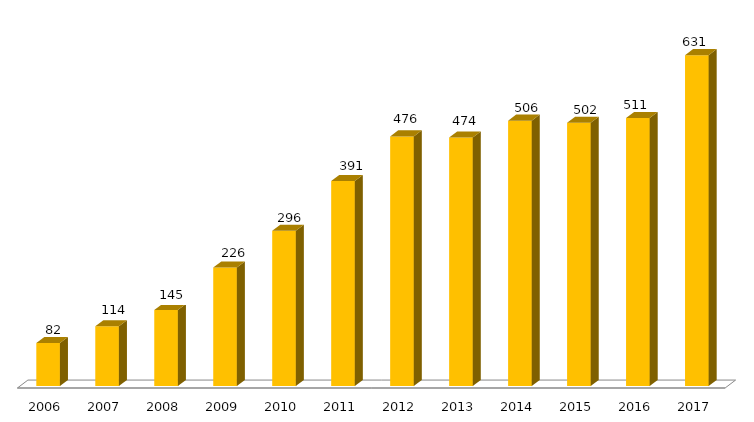
| Category | Programa |
|---|---|
| 2006.0 | 82 |
| 2007.0 | 114 |
| 2008.0 | 145 |
| 2009.0 | 226 |
| 2010.0 | 296 |
| 2011.0 | 391 |
| 2012.0 | 476 |
| 2013.0 | 474 |
| 2014.0 | 506 |
| 2015.0 | 502 |
| 2016.0 | 511 |
| 2017.0 | 631 |